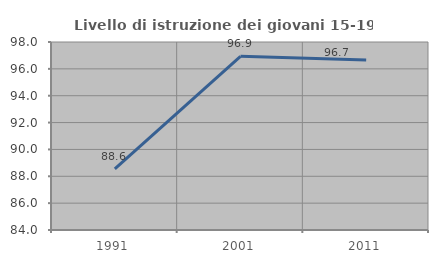
| Category | Livello di istruzione dei giovani 15-19 anni |
|---|---|
| 1991.0 | 88.555 |
| 2001.0 | 96.931 |
| 2011.0 | 96.667 |